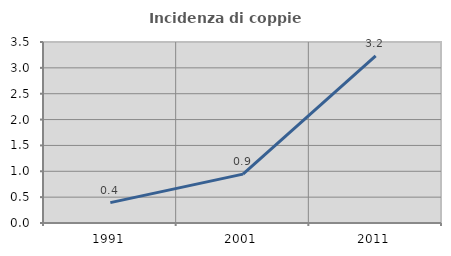
| Category | Incidenza di coppie miste |
|---|---|
| 1991.0 | 0.395 |
| 2001.0 | 0.945 |
| 2011.0 | 3.23 |